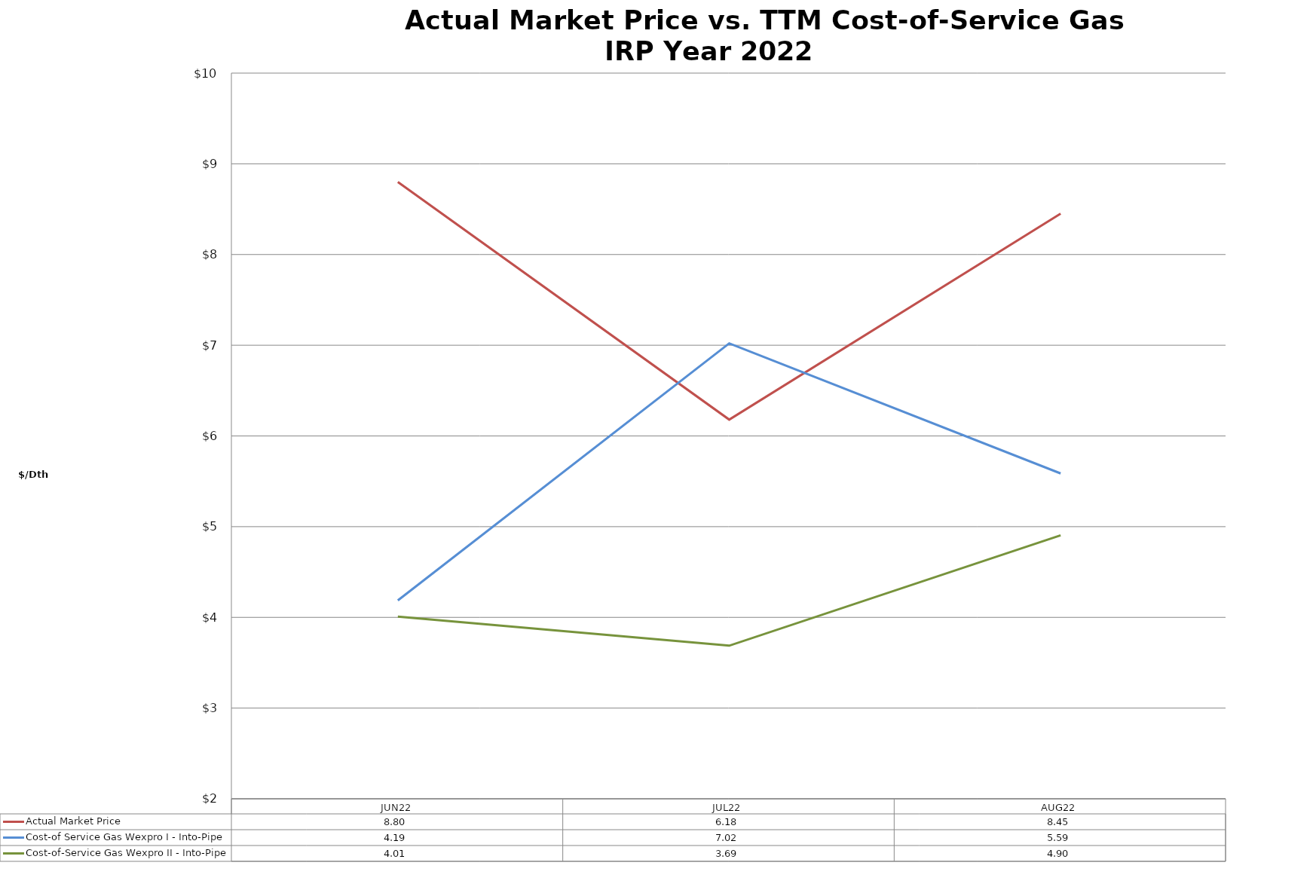
| Category | Actual Market Price | Cost-of Service Gas Wexpro I - Into-Pipe | Cost-of-Service Gas Wexpro II - Into-Pipe |
|---|---|---|---|
| JUN22 | 8.8 | 4.187 | 4.007 |
| JUL22 | 6.18 | 7.02 | 3.688 |
| AUG22 | 8.45 | 5.587 | 4.905 |